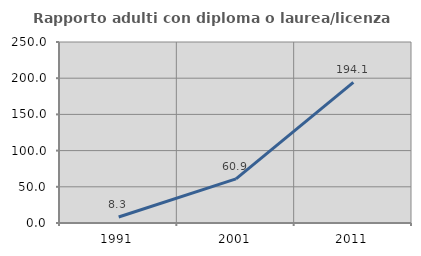
| Category | Rapporto adulti con diploma o laurea/licenza media  |
|---|---|
| 1991.0 | 8.333 |
| 2001.0 | 60.87 |
| 2011.0 | 194.118 |